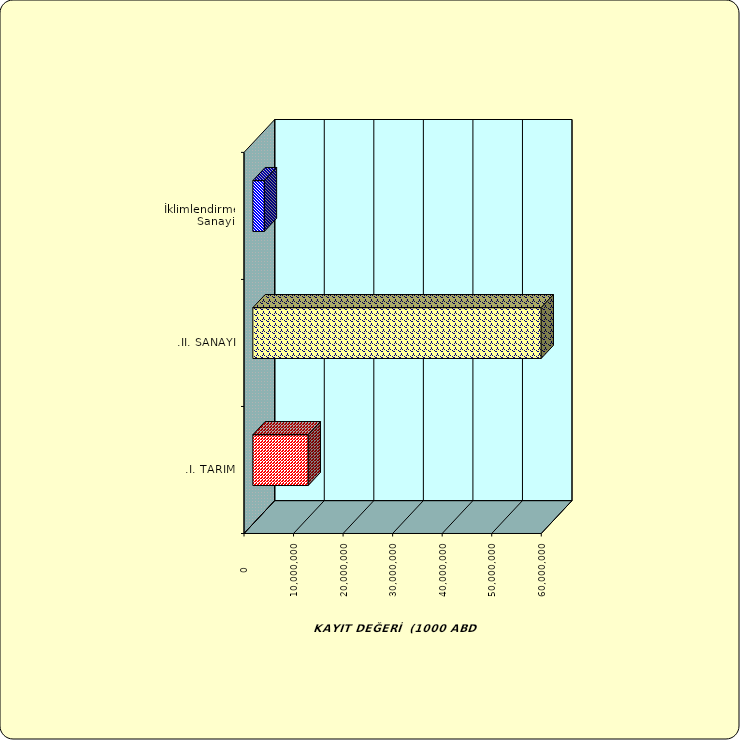
| Category | Series 0 |
|---|---|
| .I. TARIM | 11175632.236 |
| .II. SANAYİ | 58196027.259 |
|  İklimlendirme Sanayii | 2317049.773 |